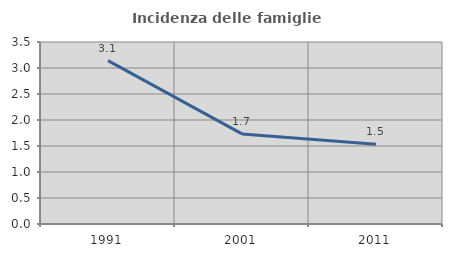
| Category | Incidenza delle famiglie numerose |
|---|---|
| 1991.0 | 3.143 |
| 2001.0 | 1.733 |
| 2011.0 | 1.534 |